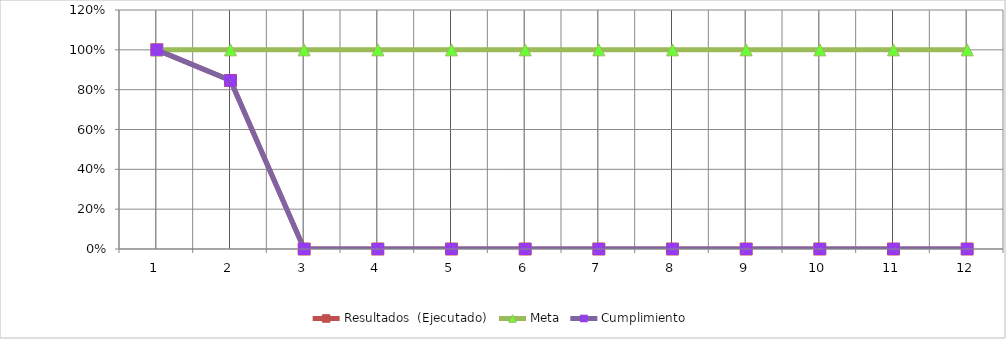
| Category | Resultados  (Ejecutado) | Meta | Cumplimiento |
|---|---|---|---|
| 0 | 1 | 1 | 1 |
| 1 | 0.846 | 1 | 0.846 |
| 2 | 0 | 1 | 0 |
| 3 | 0 | 1 | 0 |
| 4 | 0 | 1 | 0 |
| 5 | 0 | 1 | 0 |
| 6 | 0 | 1 | 0 |
| 7 | 0 | 1 | 0 |
| 8 | 0 | 1 | 0 |
| 9 | 0 | 1 | 0 |
| 10 | 0 | 1 | 0 |
| 11 | 0 | 1 | 0 |